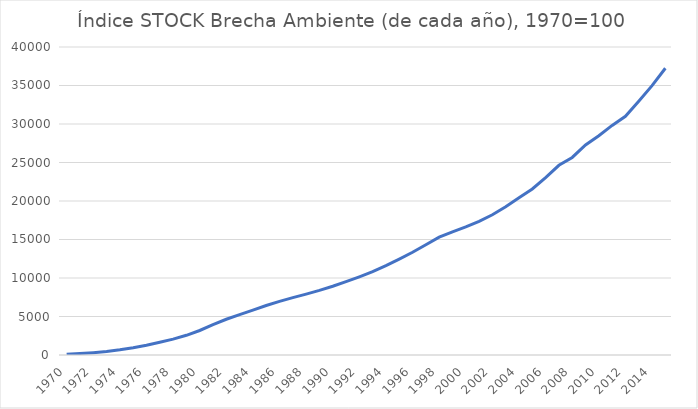
| Category | Índice STOCK Brecha Ambiente (de cada año), 1970=100 |
|---|---|
| 1970.0 | 100 |
| 1971.0 | 196.217 |
| 1972.0 | 307.518 |
| 1973.0 | 443.474 |
| 1974.0 | 674.016 |
| 1975.0 | 944.118 |
| 1976.0 | 1261.739 |
| 1977.0 | 1646.938 |
| 1978.0 | 2063.444 |
| 1979.0 | 2558.646 |
| 1980.0 | 3183.327 |
| 1981.0 | 3945.274 |
| 1982.0 | 4641.512 |
| 1983.0 | 5240.725 |
| 1984.0 | 5831.554 |
| 1985.0 | 6430.648 |
| 1986.0 | 6965.639 |
| 1987.0 | 7452.815 |
| 1988.0 | 7908.776 |
| 1989.0 | 8394.044 |
| 1990.0 | 8926.42 |
| 1991.0 | 9519.893 |
| 1992.0 | 10151.992 |
| 1993.0 | 10813.592 |
| 1994.0 | 11606.89 |
| 1995.0 | 12460.422 |
| 1996.0 | 13341.674 |
| 1997.0 | 14325.479 |
| 1998.0 | 15302.991 |
| 1999.0 | 15989.274 |
| 2000.0 | 16629.531 |
| 2001.0 | 17344.003 |
| 2002.0 | 18209.094 |
| 2003.0 | 19239.753 |
| 2004.0 | 20428.191 |
| 2005.0 | 21557.551 |
| 2006.0 | 23045.128 |
| 2007.0 | 24638.236 |
| 2008.0 | 25656.31 |
| 2009.0 | 27278.477 |
| 2010.0 | 28476.905 |
| 2011.0 | 29814.424 |
| 2012.0 | 31006.528 |
| 2013.0 | 32951.813 |
| 2014.0 | 34983.272 |
| 2015.0 | 37243.733 |